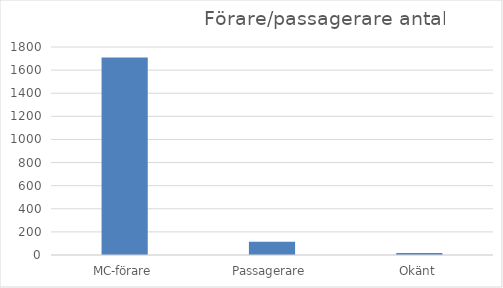
| Category | Antal |
|---|---|
| MC-förare | 1710 |
| Passagerare | 115 |
| Okänt | 18 |